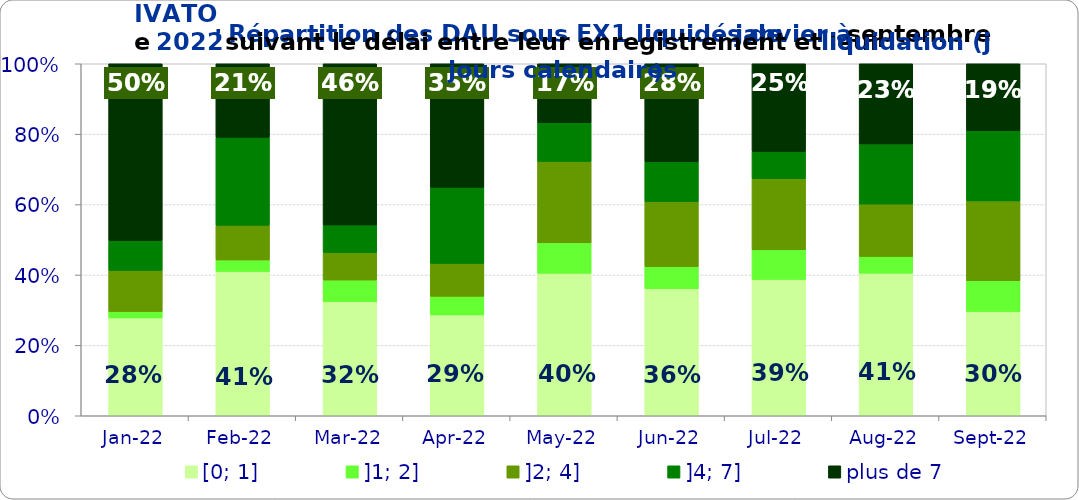
| Category | [0; 1] | ]1; 2] | ]2; 4] | ]4; 7] | plus de 7 |
|---|---|---|---|---|---|
| 2022-01-01 | 0.278 | 0.018 | 0.117 | 0.085 | 0.502 |
| 2022-02-01 | 0.41 | 0.033 | 0.098 | 0.25 | 0.209 |
| 2022-03-01 | 0.324 | 0.061 | 0.078 | 0.078 | 0.458 |
| 2022-04-01 | 0.287 | 0.053 | 0.094 | 0.216 | 0.351 |
| 2022-05-01 | 0.405 | 0.087 | 0.231 | 0.11 | 0.168 |
| 2022-06-01 | 0.361 | 0.063 | 0.184 | 0.114 | 0.278 |
| 2022-07-01 | 0.387 | 0.084 | 0.202 | 0.077 | 0.249 |
| 2022-08-01 | 0.405 | 0.047 | 0.149 | 0.171 | 0.228 |
| 2022-09-01 | 0.296 | 0.088 | 0.227 | 0.199 | 0.19 |